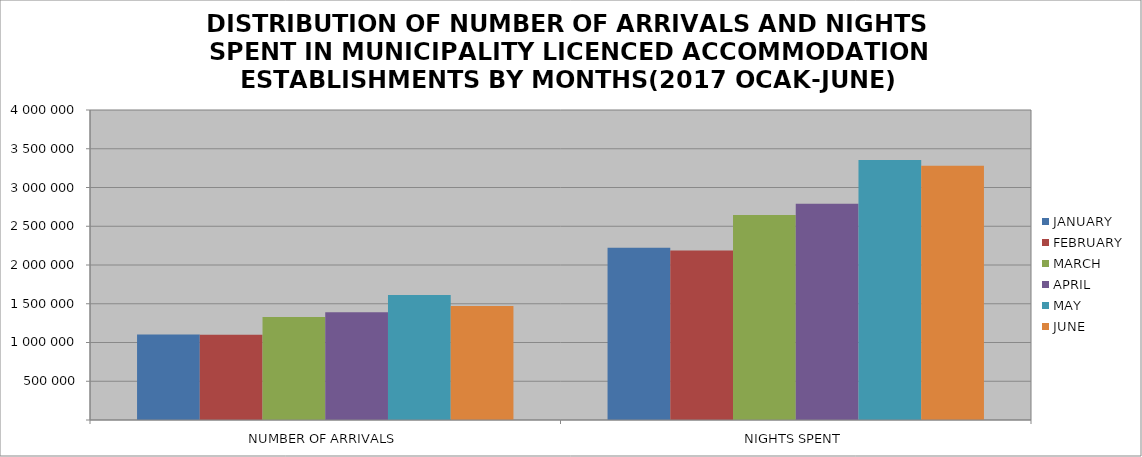
| Category | JANUARY | FEBRUARY | MARCH | APRIL | MAY | JUNE |
|---|---|---|---|---|---|---|
| NUMBER OF ARRIVALS | 1104649 | 1099366 | 1327993 | 1389075 | 1611959 | 1472053 |
| NIGHTS SPENT | 2222261 | 2187982 | 2645959 | 2791881 | 3355819 | 3280620 |